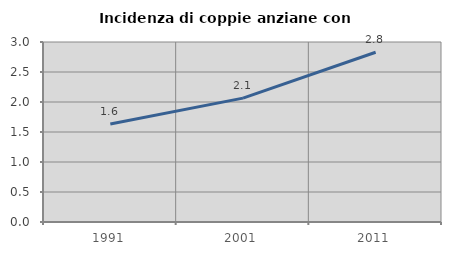
| Category | Incidenza di coppie anziane con figli |
|---|---|
| 1991.0 | 1.635 |
| 2001.0 | 2.065 |
| 2011.0 | 2.83 |